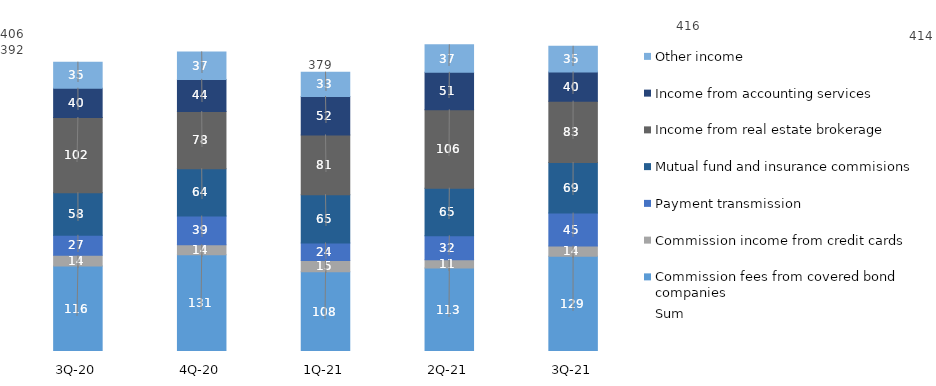
| Category | Commission fees from covered bond companies | Commission income from credit cards | Payment transmission | Mutual fund and insurance commisions | Income from real estate brokerage | Income from accounting services | Other income |
|---|---|---|---|---|---|---|---|
| 3Q-21 | 129.121 | 13.933 | 44.608 | 68.583 | 83.084 | 39.614 | 34.713 |
| 2Q-21 | 113.288 | 11.051 | 32.388 | 64.605 | 106.238 | 50.876 | 37.171 |
| 1Q-21 | 107.955 | 15.25 | 23.942 | 65.464 | 80.888 | 52.216 | 32.873 |
| 4Q-20 | 131.015 | 13.687 | 38.872 | 64.05 | 77.589 | 43.624 | 37.225 |
| 3Q-20 | 116.034 | 14.295 | 27.183 | 57.628 | 101.952 | 39.804 | 35.242 |